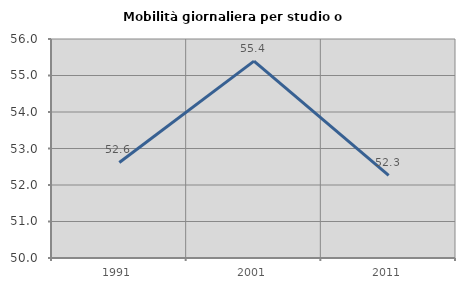
| Category | Mobilità giornaliera per studio o lavoro |
|---|---|
| 1991.0 | 52.617 |
| 2001.0 | 55.395 |
| 2011.0 | 52.262 |